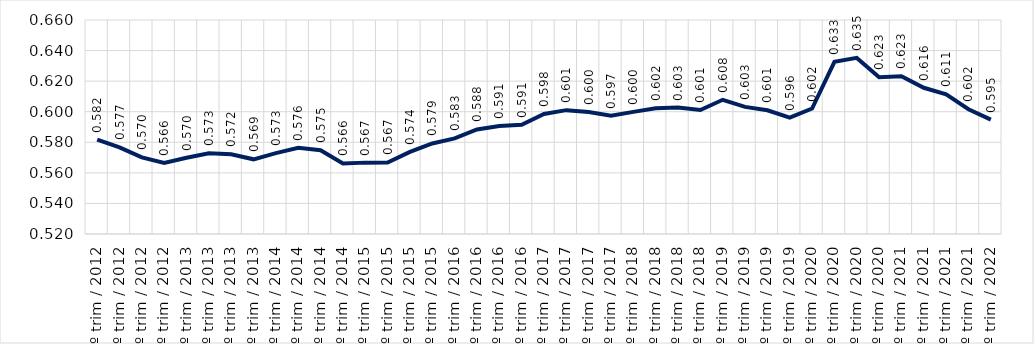
| Category | Média conjunto RMs |
|---|---|
| 1º trim / 2012 | 0.582 |
| 2º trim / 2012 | 0.577 |
| 3º trim / 2012 | 0.57 |
| 4º trim / 2012 | 0.566 |
| 1º trim / 2013 | 0.57 |
| 2º trim / 2013 | 0.573 |
| 3º trim / 2013 | 0.572 |
| 4º trim / 2013 | 0.569 |
| 1º trim / 2014 | 0.573 |
| 2º trim / 2014 | 0.576 |
| 3º trim / 2014 | 0.575 |
| 4º trim / 2014 | 0.566 |
| 1º trim / 2015 | 0.567 |
| 2º trim / 2015 | 0.567 |
| 3º trim / 2015 | 0.574 |
| 4º trim / 2015 | 0.579 |
| 1º trim / 2016 | 0.583 |
| 2º trim / 2016 | 0.588 |
| 3º trim / 2016 | 0.591 |
| 4º trim / 2016 | 0.591 |
| 1º trim / 2017 | 0.598 |
| 2º trim / 2017 | 0.601 |
| 3º trim / 2017 | 0.6 |
| 4º trim / 2017 | 0.597 |
| 1º trim / 2018 | 0.6 |
| 2º trim / 2018 | 0.602 |
| 3º trim / 2018 | 0.603 |
| 4º trim / 2018 | 0.601 |
| 1º trim / 2019 | 0.608 |
| 2º trim / 2019 | 0.603 |
| 3º trim / 2019 | 0.601 |
| 4º trim / 2019 | 0.596 |
| 1º trim / 2020 | 0.602 |
| 2º trim / 2020 | 0.633 |
| 3º trim / 2020 | 0.635 |
| 4º trim / 2020 | 0.623 |
| 1º trim / 2021 | 0.623 |
| 2º trim / 2021 | 0.616 |
| 3º trim / 2021 | 0.611 |
| 4º trim / 2021 | 0.602 |
| 1º trim / 2022 | 0.595 |